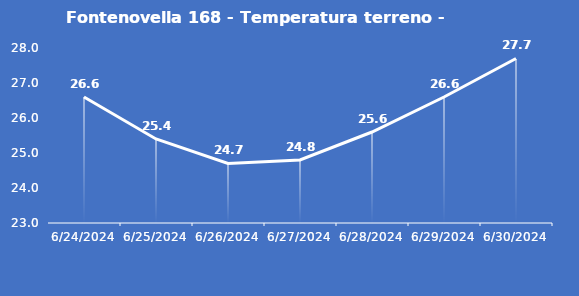
| Category | Fontenovella 168 - Temperatura terreno - Grezzo (°C) |
|---|---|
| 6/24/24 | 26.6 |
| 6/25/24 | 25.4 |
| 6/26/24 | 24.7 |
| 6/27/24 | 24.8 |
| 6/28/24 | 25.6 |
| 6/29/24 | 26.6 |
| 6/30/24 | 27.7 |